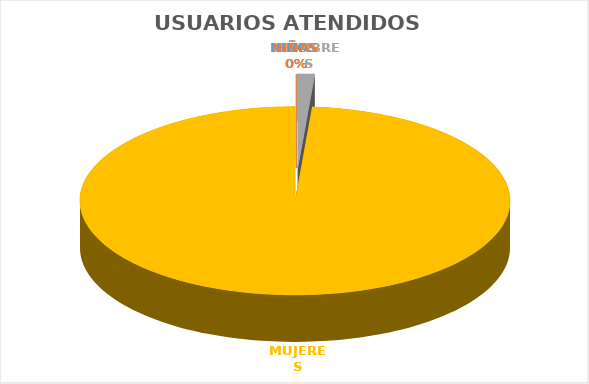
| Category | USUARIOS ATENDIDOS  |
|---|---|
| NIÑOS  | 0 |
| NIÑAS | 0 |
| HOMBRES | 4 |
| MUJERES | 313 |